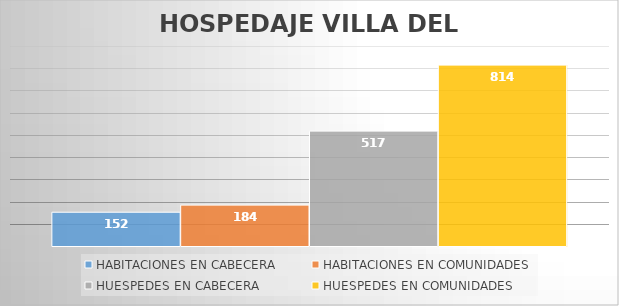
| Category | HABITACIONES EN CABECERA | HABITACIONES EN COMUNIDADES | HUESPEDES EN CABECERA | HUESPEDES EN COMUNIDADES |
|---|---|---|---|---|
| 0 | 152 | 184 | 517 | 814 |